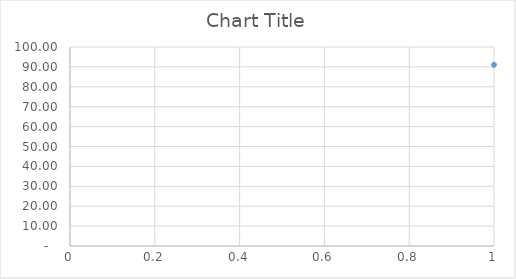
| Category | Series 0 |
|---|---|
| 0 | 91.03 |
| 1 | 53.27 |
| 2 | 45.19 |
| 3 | 52.34 |
| 4 | 50.68 |
| 5 | 52.06 |
| 6 | 40.44 |
| 7 | 55.99 |
| 8 | 27.85 |
| 9 | 32.35 |
| 10 | 65.26 |
| 11 | 38.04 |
| 12 | 35.11 |
| 13 | 31.2 |
| 14 | 30.46 |
| 15 | 19.63 |
| 16 | 28.94 |
| 17 | 36.59 |
| 18 | 43.14 |
| 19 | 45.29 |
| 20 | 25.79 |
| 21 | 61.94 |
| 22 | 37.99 |
| 23 | 29.81 |
| 24 | 24.91 |
| 25 | 23.28 |
| 26 | 40.8 |
| 27 | 14.33 |
| 28 | 34.25 |
| 29 | 33.53 |
| 30 | 28.19 |
| 31 | 31.8 |
| 32 | 38.83 |
| 33 | 57.28 |
| 34 | 30.04 |
| 35 | 20.26 |
| 36 | 30.17 |
| 37 | 45.66 |
| 38 | 57.2 |
| 39 | 26.93 |
| 40 | 30.84 |
| 41 | 16.71 |
| 42 | 33.64 |
| 43 | 27.07 |
| 44 | 37.07 |
| 45 | 48.45 |
| 46 | 29.81 |
| 47 | 37.12 |
| 48 | 53.68 |
| 49 | 12.35 |
| 50 | 34.51 |
| 51 | 22.52 |
| 52 | 57.27 |
| 53 | 33.42 |
| 54 | 8.92 |
| 55 | 23.59 |
| 56 | 32.52 |
| 57 | 8.78 |
| 58 | 22.91 |
| 59 | 27.14 |
| 60 | 29.68 |
| 61 | 33.73 |
| 62 | 18.24 |
| 63 | 37.59 |
| 64 | 44.73 |
| 65 | 34.19 |
| 66 | 55.81 |
| 67 | 16.02 |
| 68 | 36.86 |
| 69 | 56.55 |
| 70 | 56.09 |
| 71 | 35.01 |
| 72 | 26.29 |
| 73 | 39.61 |
| 74 | 26.16 |
| 75 | 32.23 |
| 76 | 44.25 |
| 77 | 18.32 |
| 78 | 23.3 |
| 79 | 14.69 |
| 80 | 21.25 |
| 81 | 55.47 |
| 82 | 19.42 |
| 83 | 40.35 |
| 84 | 15.9 |
| 85 | 35.36 |
| 86 | 17.83 |
| 87 | 14.86 |
| 88 | 37.17 |
| 89 | 37.73 |
| 90 | 56.49 |
| 91 | 19.06 |
| 92 | 30.81 |
| 93 | 37.22 |
| 94 | 19.68 |
| 95 | 12.3 |
| 96 | 36.93 |
| 97 | 51.46 |
| 98 | 38.26 |
| 99 | 55.54 |
| 100 | 30.44 |
| 101 | 35.27 |
| 102 | 23.52 |
| 103 | 37.18 |
| 104 | 26.75 |
| 105 | 56.57 |
| 106 | 4.97 |
| 107 | 17.29 |
| 108 | 23.5 |
| 109 | 33.6 |
| 110 | 31.82 |
| 111 | 4.31 |
| 112 | 38.1 |
| 113 | 35.32 |
| 114 | 19.28 |
| 115 | 35.39 |
| 116 | 4.27 |
| 117 | 17.49 |
| 118 | 17.32 |
| 119 | 4.32 |
| 120 | 43.58 |
| 121 | 57.99 |
| 122 | 21.28 |
| 123 | 36.43 |
| 124 | 3.49 |
| 125 | 17.26 |
| 126 | 25.38 |
| 127 | 25.57 |
| 128 | 17.3 |
| 129 | 19.5 |
| 130 | 18.98 |
| 131 | 15.86 |
| 132 | 22.81 |
| 133 | 8.29 |
| 134 | 56.25 |
| 135 | 37.64 |
| 136 | 13.34 |
| 137 | 35.47 |
| 138 | 38.02 |
| 139 | 6.77 |
| 140 | 38.05 |
| 141 | 8.22 |
| 142 | 34.69 |
| 143 | 11.19 |
| 144 | 17.9 |
| 145 | 19.16 |
| 146 | 8.14 |
| 147 | 43.71 |
| 148 | 5.76 |
| 149 | 54.59 |
| 150 | 37.99 |
| 151 | 18.56 |
| 152 | 19.45 |
| 153 | 10.17 |
| 154 | 18.95 |
| 155 | 23.12 |
| 156 | 36.48 |
| 157 | 20.98 |
| 158 | 32.75 |
| 159 | 34.38 |
| 160 | 16.71 |
| 161 | 37.56 |
| 162 | 19.26 |
| 163 | 56.35 |
| 164 | 26.89 |
| 165 | 14.82 |
| 166 | 1.84 |
| 167 | 39.14 |
| 168 | 6.39 |
| 169 | 13.77 |
| 170 | 37.22 |
| 171 | 14.8 |
| 172 | 19.37 |
| 173 | 37.6 |
| 174 | 19.35 |
| 175 | 18.94 |
| 176 | 19.4 |
| 177 | 16.9 |
| 178 | 57.12 |
| 179 | 18.09 |
| 180 | 37.46 |
| 181 | 37.96 |
| 182 | 17.6 |
| 183 | 19.05 |
| 184 | 36.09 |
| 185 | 37.71 |
| 186 | 55.54 |
| 187 | 20 |
| 188 | 33.49 |
| 189 | 0.97 |
| 190 | 3.87 |
| 191 | 6.88 |
| 192 | 34.5 |
| 193 | 2.9 |
| 194 | 19.52 |
| 195 | 33.65 |
| 196 | 1.38 |
| 197 | 36.89 |
| 198 | 19.32 |
| 199 | 57.42 |
| 200 | 57.78 |
| 201 | 36.32 |
| 202 | 57.75 |
| 203 | 52.94 |
| 204 | 54.6 |
| 205 | 19.72 |
| 206 | 2.5 |
| 207 | 0.22 |
| 208 | 19.31 |
| 209 | 17.33 |
| 210 | 19.03 |
| 211 | 22.08 |
| 212 | 19.64 |
| 213 | 0 |
| 214 | 0 |
| 215 | 0 |
| 216 | 0 |
| 217 | 0 |
| 218 | 0 |
| 219 | 0 |
| 220 | 0 |
| 221 | 0 |
| 222 | 16.79 |
| 223 | 22.42 |
| 224 | 19.87 |
| 225 | 18.12 |
| 226 | 38 |
| 227 | 34.46 |
| 228 | 37.86 |
| 229 | 18.95 |
| 230 | 36.4 |
| 231 | 19.45 |
| 232 | 19.3 |
| 233 | 18.96 |
| 234 | 37.38 |
| 235 | 37.69 |
| 236 | 17.42 |
| 237 | 19.8 |
| 238 | 16.41 |
| 239 | 19.85 |
| 240 | 38.26 |
| 241 | 32.39 |
| 242 | 37.29 |
| 243 | 35.39 |
| 244 | 19.8 |
| 245 | 19.68 |
| 246 | 19.72 |
| 247 | 19.4 |
| 248 | 19.53 |
| 249 | 19.15 |
| 250 | 36.46 |
| 251 | 30.91 |
| 252 | 19.71 |
| 253 | 32.56 |
| 254 | 19.72 |
| 255 | 19.79 |
| 256 | 18.75 |
| 257 | 29.02 |
| 258 | 18.06 |
| 259 | 34.79 |
| 260 | 37.55 |
| 261 | 19.66 |
| 262 | 38.18 |
| 263 | 37.61 |
| 264 | 20.19 |
| 265 | 30.76 |
| 266 | 37.39 |
| 267 | 19.58 |
| 268 | 19.35 |
| 269 | 19.04 |
| 270 | 37.43 |
| 271 | 37.85 |
| 272 | 24.8 |
| 273 | 36.66 |
| 274 | 19.84 |
| 275 | 37.25 |
| 276 | 37.52 |
| 277 | 19.96 |
| 278 | 19.12 |
| 279 | 37.53 |
| 280 | 37.2 |
| 281 | 35.54 |
| 282 | 36.7 |
| 283 | 19.73 |
| 284 | 37.06 |
| 285 | 36.16 |
| 286 | 18.96 |
| 287 | 37.32 |
| 288 | 19.71 |
| 289 | 19.8 |
| 290 | 37.97 |
| 291 | 19.7 |
| 292 | 19.24 |
| 293 | 41.28 |
| 294 | 19.55 |
| 295 | 36.91 |
| 296 | 37.99 |
| 297 | 37.39 |
| 298 | 35.47 |
| 299 | 19.48 |
| 300 | 38.25 |
| 301 | 19.46 |
| 302 | 37.28 |
| 303 | 37.97 |
| 304 | 57.02 |
| 305 | 19.2 |
| 306 | 19.37 |
| 307 | 55.19 |
| 308 | 52.61 |
| 309 | 36.6 |
| 310 | 36.99 |
| 311 | 37.53 |
| 312 | 54.58 |
| 313 | 33.87 |
| 314 | 37.35 |
| 315 | 20.05 |
| 316 | 20.3 |
| 317 | 19.23 |
| 318 | 37.75 |
| 319 | 36.7 |
| 320 | 38.17 |
| 321 | 36.78 |
| 322 | 37.41 |
| 323 | 27.69 |
| 324 | 19.6 |
| 325 | 37.65 |
| 326 | 37.93 |
| 327 | 37.9 |
| 328 | 38.01 |
| 329 | 38.11 |
| 330 | 19.52 |
| 331 | 20.04 |
| 332 | 36.9 |
| 333 | 37.83 |
| 334 | 37.27 |
| 335 | 20.37 |
| 336 | 37.68 |
| 337 | 35.92 |
| 338 | 38.27 |
| 339 | 37.66 |
| 340 | 38.02 |
| 341 | 27.85 |
| 342 | 18.39 |
| 343 | 37.41 |
| 344 | 19.88 |
| 345 | 35.92 |
| 346 | 55.11 |
| 347 | 19.3 |
| 348 | 36.91 |
| 349 | 57.69 |
| 350 | 37.97 |
| 351 | 37.93 |
| 352 | 36.36 |
| 353 | 37.85 |
| 354 | 37.31 |
| 355 | 35.94 |
| 356 | 37.82 |
| 357 | 37.64 |
| 358 | 56.39 |
| 359 | 31.57 |
| 360 | 36.08 |
| 361 | 38.53 |
| 362 | 37.14 |
| 363 | 37.94 |
| 364 | 36.25 |
| 365 | 29.8 |
| 366 | 37.85 |
| 367 | 55.83 |
| 368 | 37.36 |
| 369 | 35.63 |
| 370 | 37.93 |
| 371 | 37.71 |
| 372 | 35.86 |
| 373 | 39.12 |
| 374 | 36.34 |
| 375 | 37.7 |
| 376 | 38.12 |
| 377 | 35.04 |
| 378 | 38.38 |
| 379 | 38.19 |
| 380 | 37.54 |
| 381 | 39.62 |
| 382 | 37.63 |
| 383 | 38.21 |
| 384 | 37.36 |
| 385 | 37.81 |
| 386 | 38.1 |
| 387 | 37.73 |
| 388 | 37.2 |
| 389 | 37.45 |
| 390 | 37.58 |
| 391 | 57.21 |
| 392 | 37.9 |
| 393 | 37.48 |
| 394 | 57.52 |
| 395 | 38.15 |
| 396 | 38.21 |
| 397 | 38.01 |
| 398 | 38.26 |
| 399 | 38.65 |
| 400 | 57.81 |
| 401 | 37.86 |
| 402 | 38.1 |
| 403 | 57.45 |
| 404 | 57.99 |
| 405 | 57.91 |
| 406 | 58.15 |